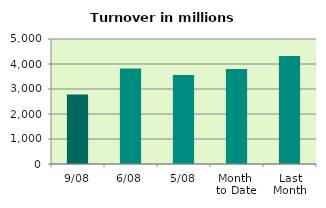
| Category | Series 0 |
|---|---|
| 9/08 | 2775.566 |
| 6/08 | 3820.183 |
| 5/08 | 3564.288 |
| Month 
to Date | 3796.06 |
| Last
Month | 4319.965 |